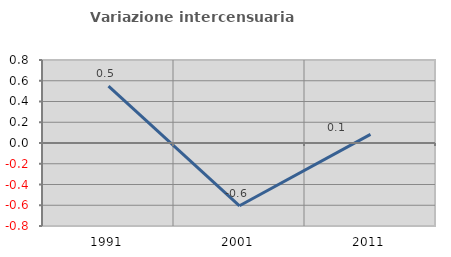
| Category | Variazione intercensuaria annua |
|---|---|
| 1991.0 | 0.548 |
| 2001.0 | -0.605 |
| 2011.0 | 0.083 |